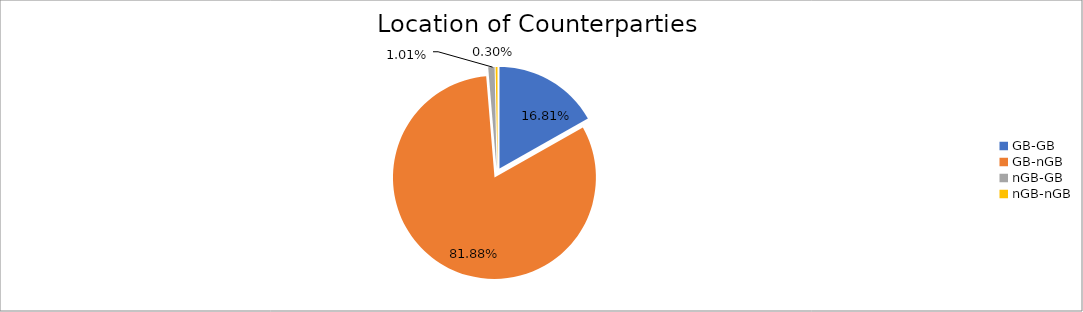
| Category | Series 0 |
|---|---|
| GB-GB | 1493184.805 |
| GB-nGB | 7272455.264 |
| nGB-GB | 89534.499 |
| nGB-nGB | 26335.89 |